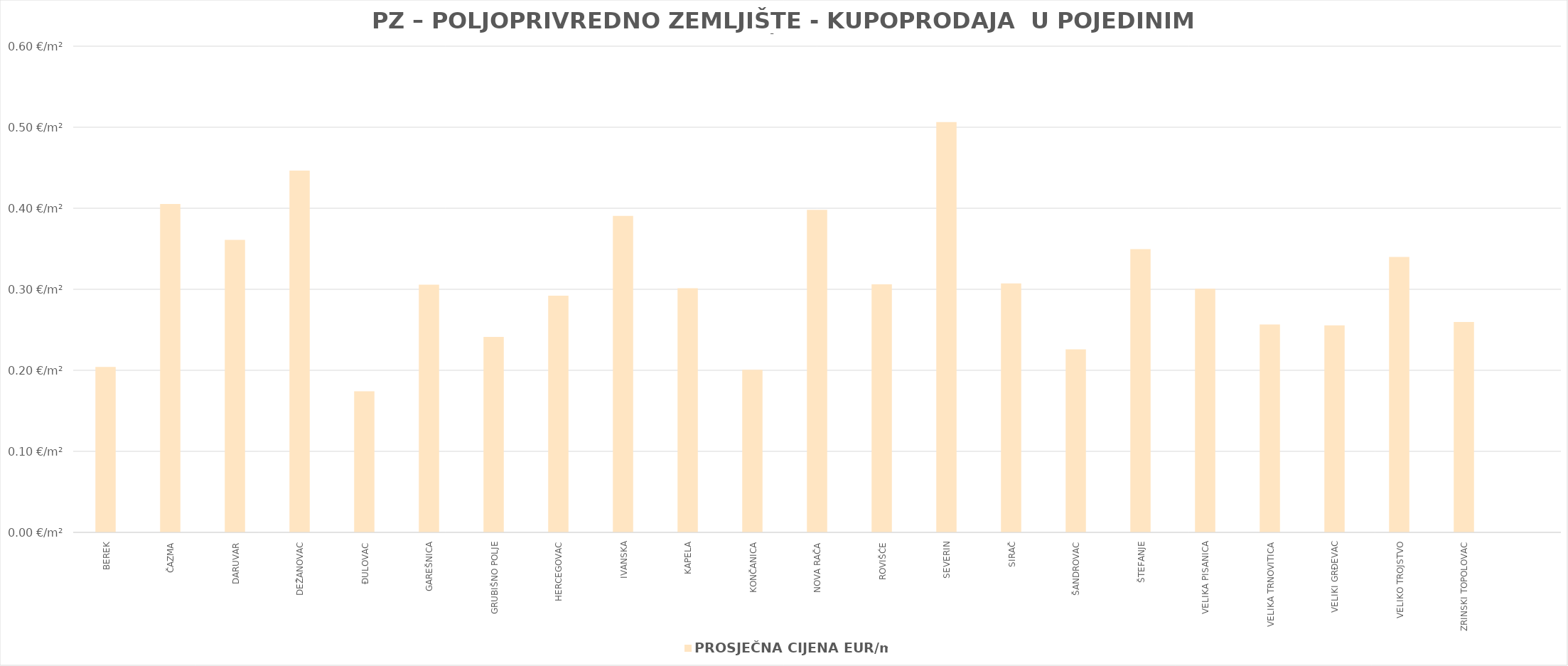
| Category | PROSJEČNA CIJENA EUR/m2 |
|---|---|
| BEREK | 0.204 |
| ČAZMA | 0.405 |
| DARUVAR | 0.361 |
| DEŽANOVAC | 0.447 |
| ĐULOVAC | 0.174 |
| GAREŠNICA | 0.306 |
| GRUBIŠNO POLJE | 0.241 |
| HERCEGOVAC | 0.292 |
| IVANSKA | 0.391 |
| KAPELA | 0.301 |
| KONČANICA | 0.201 |
| NOVA RAČA | 0.398 |
| ROVIŠĆE | 0.306 |
| SEVERIN | 0.506 |
| SIRAČ | 0.307 |
| ŠANDROVAC | 0.226 |
| ŠTEFANJE | 0.349 |
| VELIKA PISANICA | 0.301 |
| VELIKA TRNOVITICA | 0.257 |
| VELIKI GRĐEVAC | 0.256 |
| VELIKO TROJSTVO | 0.34 |
| ZRINSKI TOPOLOVAC | 0.26 |